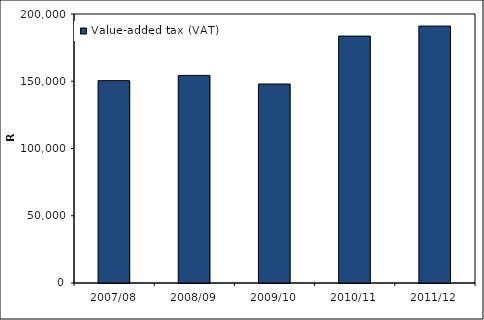
| Category | Value-added tax (VAT) |
|---|---|
| 2007/08 | 150442.849 |
| 2008/09 | 154343.121 |
| 2009/10 | 147941.322 |
| 2010/11 | 183571.439 |
| 2011/12 | 191020.199 |